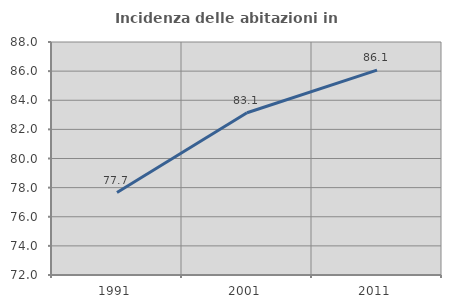
| Category | Incidenza delle abitazioni in proprietà  |
|---|---|
| 1991.0 | 77.66 |
| 2001.0 | 83.141 |
| 2011.0 | 86.066 |